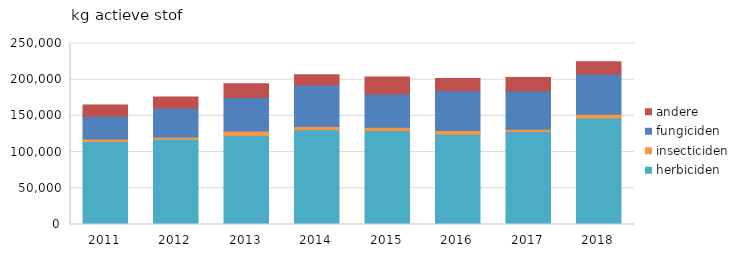
| Category | herbiciden | insecticiden | fungiciden | andere |
|---|---|---|---|---|
| 2011.0 | 114708.98 | 3372.393 | 31465.857 | 15495.609 |
| 2012.0 | 117821.916 | 2974.218 | 40148.601 | 15060.486 |
| 2013.0 | 122979.711 | 6182.866 | 46200.983 | 18983.605 |
| 2014.0 | 130760.471 | 4746.218 | 57168.485 | 14267.415 |
| 2015.0 | 129788.324 | 4473.504 | 45833.009 | 23539.65 |
| 2016.0 | 124564.367 | 5180.532 | 54938.67 | 16955.338 |
| 2017.0 | 128413.751 | 3133.094 | 52757.661 | 18787.388 |
| 2018.0 | 147062.989 | 5241.743 | 55465.299 | 17171.076 |